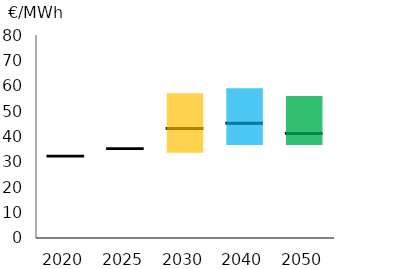
| Category | Series 1 | Series 2 | Series 3 | Series 4 |
|---|---|---|---|---|
| 2020.0 | 0 | 32 | 0.1 | -32.1 |
| 2025.0 | 0 | 35 | 0.1 | -35.1 |
| 2030.0 | 34 | 9 | 0.1 | 13.9 |
| 2040.0 | 37 | 8 | 0.1 | 13.9 |
| 2050.0 | 37 | 4 | 0.1 | 14.9 |